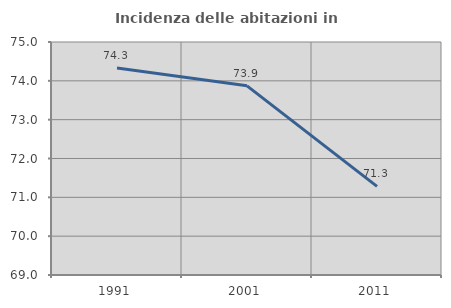
| Category | Incidenza delle abitazioni in proprietà  |
|---|---|
| 1991.0 | 74.328 |
| 2001.0 | 73.871 |
| 2011.0 | 71.283 |